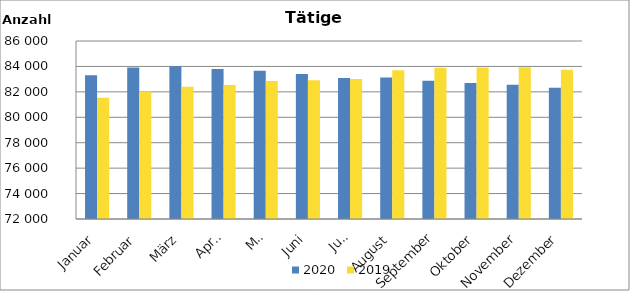
| Category | 2020 | 2019 |
|---|---|---|
| Januar | 83306 | 81531 |
| Februar | 83918 | 82034 |
| März | 84014 | 82411 |
| April | 83790 | 82539 |
| Mai | 83660 | 82861 |
| Juni | 83401 | 82905 |
| Juli | 83081 | 83013 |
| August | 83131 | 83709 |
| September | 82878 | 83898 |
| Oktober | 82701 | 83908 |
| November | 82551 | 83942 |
| Dezember | 82327 | 83739 |